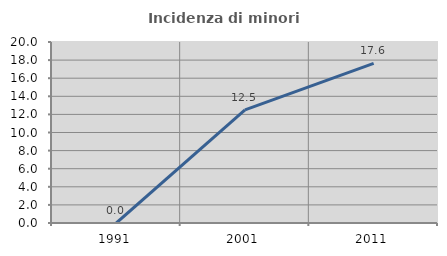
| Category | Incidenza di minori stranieri |
|---|---|
| 1991.0 | 0 |
| 2001.0 | 12.5 |
| 2011.0 | 17.647 |